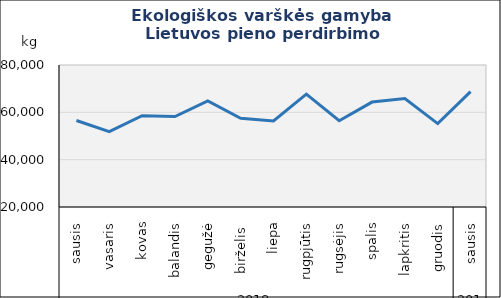
| Category | Varškė |
|---|---|
| 0 | 56556 |
| 1 | 51846 |
| 2 | 58595 |
| 3 | 58240 |
| 4 | 64854 |
| 5 | 57462 |
| 6 | 56388 |
| 7 | 67695 |
| 8 | 56432 |
| 9 | 64335 |
| 10 | 65801 |
| 11 | 55227 |
| 12 | 68771 |